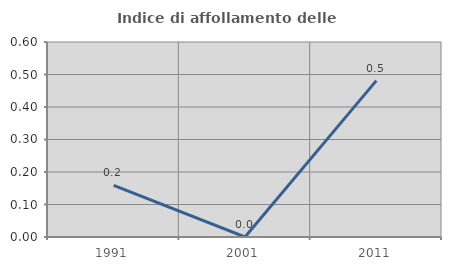
| Category | Indice di affollamento delle abitazioni  |
|---|---|
| 1991.0 | 0.159 |
| 2001.0 | 0 |
| 2011.0 | 0.481 |